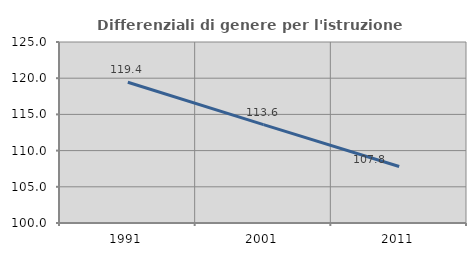
| Category | Differenziali di genere per l'istruzione superiore |
|---|---|
| 1991.0 | 119.433 |
| 2001.0 | 113.581 |
| 2011.0 | 107.806 |